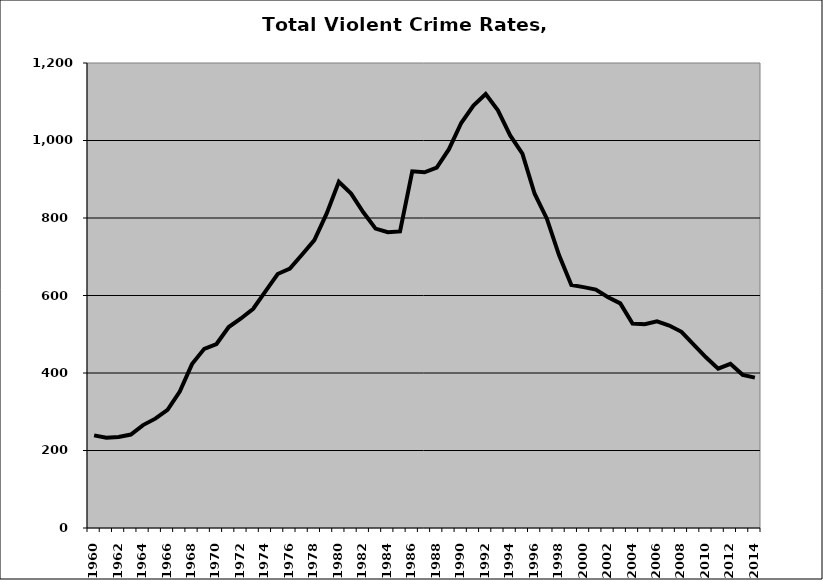
| Category | VCR |
|---|---|
| 1960.0 | 238.961 |
| 1961.0 | 232.689 |
| 1962.0 | 234.803 |
| 1963.0 | 241.154 |
| 1964.0 | 265.572 |
| 1965.0 | 282.174 |
| 1966.0 | 305.096 |
| 1967.0 | 352.143 |
| 1968.0 | 422.938 |
| 1969.0 | 462.264 |
| 1970.0 | 474.818 |
| 1971.0 | 518.578 |
| 1972.0 | 540.683 |
| 1973.0 | 565.812 |
| 1974.0 | 610.599 |
| 1975.0 | 655.379 |
| 1976.0 | 669.336 |
| 1977.0 | 705.983 |
| 1978.0 | 742.917 |
| 1979.0 | 811.099 |
| 1980.0 | 893.608 |
| 1981.0 | 862.97 |
| 1982.0 | 814.71 |
| 1983.0 | 772.587 |
| 1984.0 | 763.364 |
| 1985.0 | 765.268 |
| 1986.0 | 920.537 |
| 1987.0 | 917.988 |
| 1988.0 | 929.821 |
| 1989.0 | 977.655 |
| 1990.0 | 1045.198 |
| 1991.0 | 1089.934 |
| 1992.0 | 1119.72 |
| 1993.0 | 1077.764 |
| 1994.0 | 1012.997 |
| 1995.0 | 966.013 |
| 1996.0 | 862.651 |
| 1997.0 | 798.258 |
| 1998.0 | 703.716 |
| 1999.0 | 627.178 |
| 2000.0 | 621.555 |
| 2001.0 | 615.214 |
| 2002.0 | 595.361 |
| 2003.0 | 579.626 |
| 2004.0 | 527.802 |
| 2005.0 | 526.02 |
| 2006.0 | 533.261 |
| 2007.0 | 522.592 |
| 2008.0 | 506.209 |
| 2009.0 | 473.285 |
| 2010.0 | 440.579 |
| 2011.0 | 411.165 |
| 2012.0 | 423.538 |
| 2013.0 | 395.195 |
| 2014.0 | 388.068 |